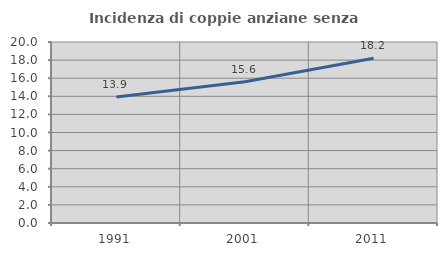
| Category | Incidenza di coppie anziane senza figli  |
|---|---|
| 1991.0 | 13.92 |
| 2001.0 | 15.607 |
| 2011.0 | 18.213 |